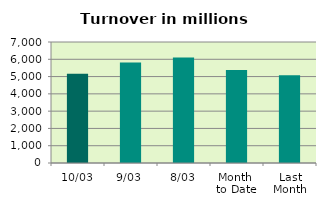
| Category | Series 0 |
|---|---|
| 10/03 | 5167.418 |
| 9/03 | 5815.005 |
| 8/03 | 6110.501 |
| Month 
to Date | 5386.414 |
| Last
Month | 5069.383 |